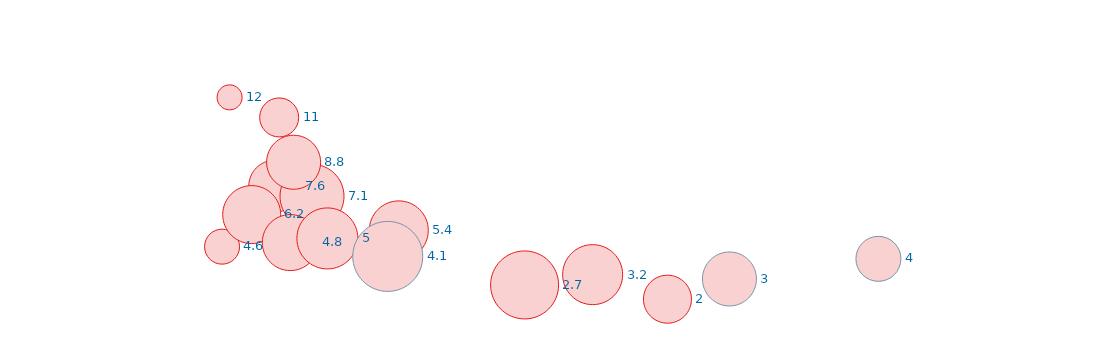
| Category | Series 0 |
|---|---|
| 7.8 | 11 |
| 4.6 | 12 |
| 7.5 | 7.6 |
| 9.9 | 7.1 |
| 8.7 | 8.8 |
| 4.1 | 4.6 |
| 6.0 | 6.2 |
| 8.5 | 4.8 |
| 10.9 | 5 |
| 15.5 | 5.4 |
| 14.8 | 4.1 |
| 23.6 | 2.7 |
| 28.0 | 3.2 |
| 32.8 | 2 |
| 36.8 | 3 |
| 46.4 | 4 |